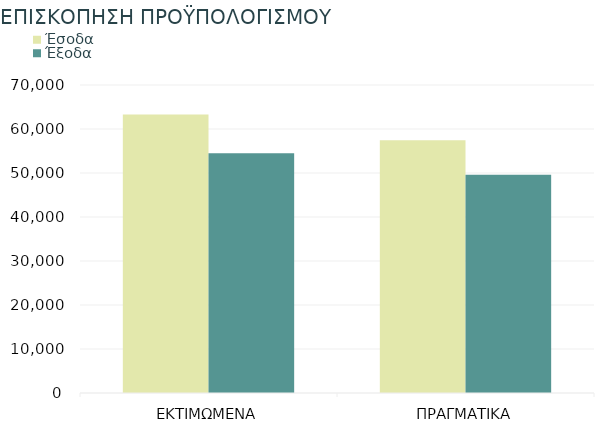
| Category | Έσοδα | Έξοδα |
|---|---|---|
| ΕΚΤΙΜΩΜΕΝΑ | 63300 | 54500 |
| ΠΡΑΓΜΑΤΙΚΑ | 57450 | 49630 |